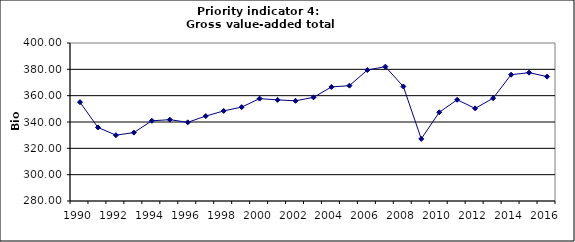
| Category | Gross value-added total industry, Bio Euro (EC95) |
|---|---|
| 1990 | 355.04 |
| 1991 | 335.868 |
| 1992 | 329.997 |
| 1993 | 331.965 |
| 1994 | 340.908 |
| 1995 | 341.787 |
| 1996 | 339.762 |
| 1997 | 344.487 |
| 1998 | 348.413 |
| 1999 | 351.3 |
| 2000 | 357.759 |
| 2001 | 356.787 |
| 2002 | 356.094 |
| 2003 | 358.718 |
| 2004 | 366.635 |
| 2005 | 367.609 |
| 2006 | 379.483 |
| 2007 | 382.017 |
| 2008 | 366.975 |
| 2009 | 327.171 |
| 2010 | 347.392 |
| 2011 | 356.877 |
| 2012 | 350.344 |
| 2013 | 358.063 |
| 2014 | 375.915 |
| 2015 | 377.483 |
| 2016 | 374.485 |